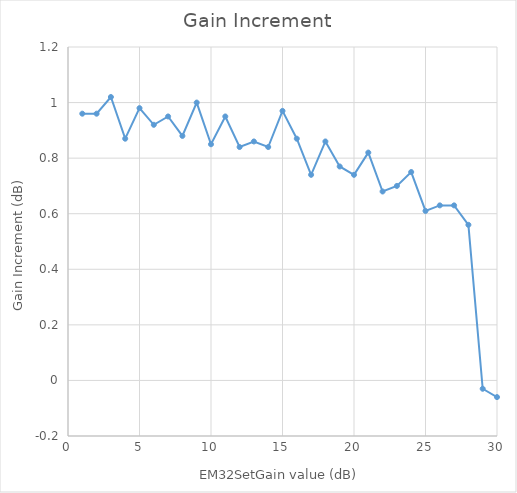
| Category | Series 0 |
|---|---|
| 1.0 | 0.96 |
| 2.0 | 0.96 |
| 3.0 | 1.02 |
| 4.0 | 0.87 |
| 5.0 | 0.98 |
| 6.0 | 0.92 |
| 7.0 | 0.95 |
| 8.0 | 0.88 |
| 9.0 | 1 |
| 10.0 | 0.85 |
| 11.0 | 0.95 |
| 12.0 | 0.84 |
| 13.0 | 0.86 |
| 14.0 | 0.84 |
| 15.0 | 0.97 |
| 16.0 | 0.87 |
| 17.0 | 0.74 |
| 18.0 | 0.86 |
| 19.0 | 0.77 |
| 20.0 | 0.74 |
| 21.0 | 0.82 |
| 22.0 | 0.68 |
| 23.0 | 0.7 |
| 24.0 | 0.75 |
| 25.0 | 0.61 |
| 26.0 | 0.63 |
| 27.0 | 0.63 |
| 28.0 | 0.56 |
| 29.0 | -0.03 |
| 30.0 | -0.06 |